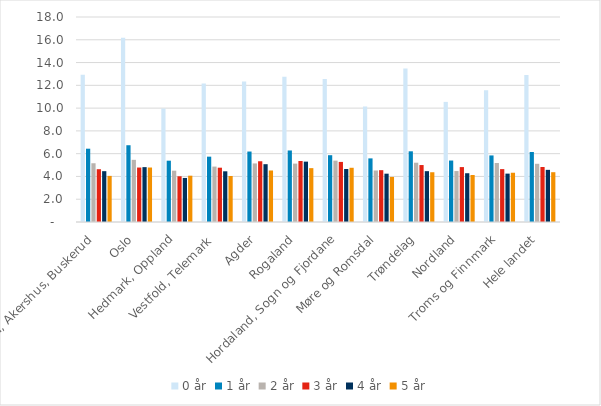
| Category | 0 år | 1 år | 2 år | 3 år | 4 år | 5 år |
|---|---|---|---|---|---|---|
| Østfold, Akershus, Buskerud | 12.933 | 6.436 | 5.159 | 4.634 | 4.463 | 4.048 |
| Oslo | 16.174 | 6.741 | 5.458 | 4.782 | 4.818 | 4.784 |
| Hedmark, Oppland | 9.963 | 5.384 | 4.505 | 4.015 | 3.867 | 4.065 |
| Vestfold, Telemark | 12.17 | 5.738 | 4.866 | 4.768 | 4.452 | 4.041 |
| Agder | 12.332 | 6.187 | 5.143 | 5.333 | 5.076 | 4.522 |
| Rogaland | 12.761 | 6.281 | 5.127 | 5.357 | 5.301 | 4.729 |
| Hordaland, Sogn og Fjordane | 12.566 | 5.865 | 5.388 | 5.276 | 4.651 | 4.761 |
| Møre og Romsdal | 10.143 | 5.586 | 4.522 | 4.551 | 4.243 | 3.958 |
| Trøndelag | 13.483 | 6.208 | 5.206 | 5.001 | 4.464 | 4.369 |
| Nordland | 10.545 | 5.397 | 4.474 | 4.822 | 4.282 | 4.126 |
| Troms og Finnmark | 11.563 | 5.845 | 5.181 | 4.644 | 4.248 | 4.326 |
| Hele landet | 12.907 | 6.148 | 5.111 | 4.827 | 4.579 | 4.373 |